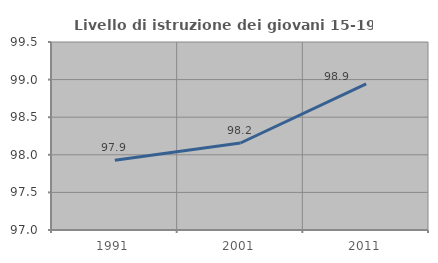
| Category | Livello di istruzione dei giovani 15-19 anni |
|---|---|
| 1991.0 | 97.929 |
| 2001.0 | 98.157 |
| 2011.0 | 98.944 |